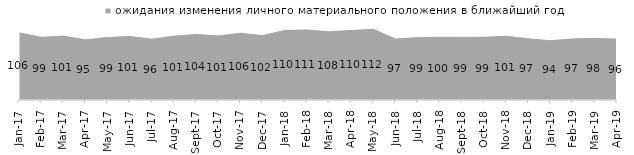
| Category | ожидания изменения личного материального положения в ближайший год |
|---|---|
| 2017-01-01 | 106.3 |
| 2017-02-01 | 99.25 |
| 2017-03-01 | 101.25 |
| 2017-04-01 | 95.3 |
| 2017-05-01 | 99.1 |
| 2017-06-01 | 100.6 |
| 2017-07-01 | 96.4 |
| 2017-08-01 | 101.15 |
| 2017-09-01 | 103.75 |
| 2017-10-01 | 101.45 |
| 2017-11-01 | 105.6 |
| 2017-12-01 | 102.05 |
| 2018-01-01 | 110.05 |
| 2018-02-01 | 110.65 |
| 2018-03-01 | 108 |
| 2018-04-01 | 109.95 |
| 2018-05-01 | 111.8 |
| 2018-06-01 | 96.75 |
| 2018-07-01 | 98.85 |
| 2018-08-01 | 99.5 |
| 2018-09-01 | 99.45 |
| 2018-10-01 | 99.4 |
| 2018-11-01 | 100.848 |
| 2018-12-01 | 97.05 |
| 2019-01-01 | 94.05 |
| 2019-02-01 | 96.75 |
| 2019-03-01 | 97.663 |
| 2019-04-01 | 96.436 |